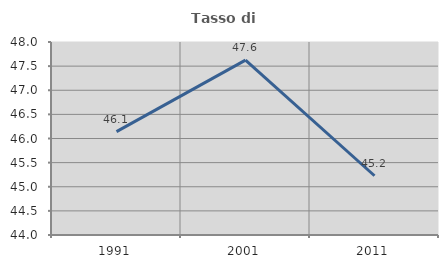
| Category | Tasso di occupazione   |
|---|---|
| 1991.0 | 46.142 |
| 2001.0 | 47.624 |
| 2011.0 | 45.228 |